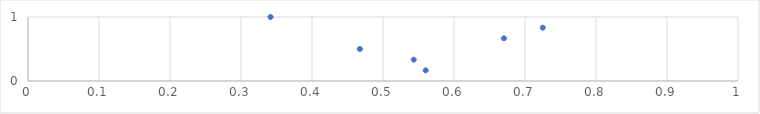
| Category | Series 0 |
|---|---|
| 0.5601398565754437 | 0.167 |
| 0.5433335155652694 | 0.333 |
| 0.4674025189317088 | 0.5 |
| 0.670349043788572 | 0.667 |
| 0.7249762946420504 | 0.833 |
| 0.3415927526544932 | 1 |